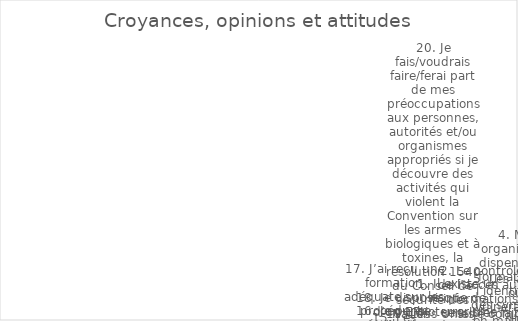
| Category | Series 0 |
|---|---|
| 1. Il existe un risque de bioterrorisme ou d’attaque avec une arme biologique. | 0 |
| 2. Le contrôle de l’accès aux informations sensibles fait partie intégrante de la biosûreté. | 4 |
| 3. Je comprends l’importance de la détermination de la fidélité. | 0 |
| 4. Mon organisation dispense une formation sur l’identification des symptômes d’un comportement à haut risque chez soi et chez les autres. | 0 |
| 5. Les lacunes ou vulnérabilités en matière de biosécurité et/ou de biosûreté sont corrigées avec un sentiment d’urgence. | 2 |
| 6. Je suis fier de mon travail. | 5 |
| 7. Mon organisation et ses membres encouragent le travail d’équipe et la coopération. | 2 |
| 8. Les infractions en matière de biosécurité et de biosûreté sont traitées de manière appropriée. | 2 |
| 9. Mon organisation se soucie plus de la biosécurité que des résultats de notre travail. | 3 |
| 10. Je suis conscient qu’il y a des problèmes et des conséquences éthiques, juridiques et sociétaux liés à mes recherches. | 5 |
| 11. L’expertise technique et l’expérience soutiennent l’assurance des performances futures en matière de biosécurité. | 0 |
| 12. Dans mon organisation, les individus ont les compétences appropriées pour effectuer les tâches qui leur sont assignées et pour travailler de manière sécuritaire et efficace. | 2 |
| 13. Mon organisation a une culture qui soutient et encourage la confiance, la collaboration, la consultation et la communication en matière de biosécurité et de biosûreté. | 4 |
| 14. La politique et la législation nationales relatives aux sciences de la vie visent à assurer une protection contre le mésusage de la science.6 | 4 |
| 15. Les évaluations des risques sont des outils importants pour identifier les domaines à améliorer et des mesures spécifiques pour réduire les risques, y compris le niveau de confinement requis. | 4 |
| 16. Je pense qu’il est important de signaler non seulement les accidents et incidents de laboratoire, mais aussi les quasi-accidents. | 2 |
| 17. J’ai reçu une formation adéquate sur les procédures nécessaires pour effectuer mon travail sans compromettre la sécurité et la sûreté. | 2 |
| 18. Je dispose d’un EPI adéquat pour effectuer mon travail en toute sécurité. | 1 |
| 19. Les scientifiques ont l’obligation de ne pas nuire . | 1 |
| 20. Je fais/voudrais faire/ferai part de mes préoccupations aux personnes, autorités et/ou organismes appropriés si je découvre des activités qui violent la Convention sur les armes biologiques et à toxines, la résolution 1540 du Conseil de sécurité des N | 4 |